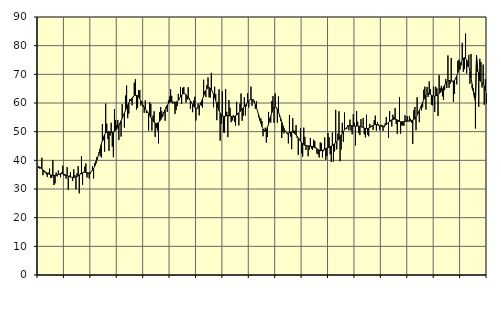
| Category | Piggar | Series 1 |
|---|---|---|
| nan | 37.4 | 37.91 |
| 87.0 | 37.1 | 37.67 |
| 87.0 | 37.5 | 37.23 |
| 87.0 | 40.9 | 36.98 |
| 87.0 | 34.8 | 36.65 |
| 87.0 | 35.7 | 36.35 |
| 87.0 | 36.1 | 36.06 |
| 87.0 | 35.1 | 35.8 |
| 87.0 | 34.2 | 35.53 |
| 87.0 | 35.7 | 35.3 |
| 87.0 | 37.1 | 35.1 |
| 87.0 | 33.9 | 34.94 |
| nan | 33.9 | 34.82 |
| 88.0 | 40.1 | 34.74 |
| 88.0 | 31.4 | 34.72 |
| 88.0 | 32 | 34.73 |
| 88.0 | 35.7 | 34.79 |
| 88.0 | 34.4 | 34.92 |
| 88.0 | 36.5 | 35.07 |
| 88.0 | 35 | 35.21 |
| 88.0 | 34.1 | 35.33 |
| 88.0 | 35.8 | 35.37 |
| 88.0 | 38.1 | 35.32 |
| 88.0 | 34.7 | 35.2 |
| nan | 34.6 | 35.03 |
| 89.0 | 33.6 | 34.81 |
| 89.0 | 37.6 | 34.59 |
| 89.0 | 29.7 | 34.43 |
| 89.0 | 34.7 | 34.28 |
| 89.0 | 35.9 | 34.17 |
| 89.0 | 34.1 | 34.1 |
| 89.0 | 32.8 | 34.07 |
| 89.0 | 36.9 | 34.06 |
| 89.0 | 34.9 | 34.1 |
| 89.0 | 29.9 | 34.19 |
| 89.0 | 35.5 | 34.35 |
| nan | 38 | 34.58 |
| 90.0 | 28.5 | 34.86 |
| 90.0 | 35.5 | 35.16 |
| 90.0 | 41.4 | 35.44 |
| 90.0 | 31.5 | 35.68 |
| 90.0 | 35.9 | 35.83 |
| 90.0 | 37.8 | 35.86 |
| 90.0 | 38.9 | 35.81 |
| 90.0 | 34 | 35.7 |
| 90.0 | 35.3 | 35.6 |
| 90.0 | 33.7 | 35.6 |
| 90.0 | 35.3 | 35.73 |
| nan | 36.3 | 36.01 |
| 91.0 | 38 | 36.48 |
| 91.0 | 33.7 | 37.14 |
| 91.0 | 39 | 37.92 |
| 91.0 | 39.8 | 38.86 |
| 91.0 | 41.2 | 39.98 |
| 91.0 | 41.2 | 41.25 |
| 91.0 | 42.9 | 42.61 |
| 91.0 | 41.6 | 44.04 |
| 91.0 | 41 | 45.51 |
| 91.0 | 52.7 | 46.9 |
| 91.0 | 47 | 48.07 |
| nan | 43 | 48.95 |
| 92.0 | 59.8 | 49.51 |
| 92.0 | 52.8 | 49.82 |
| 92.0 | 47.4 | 49.93 |
| 92.0 | 43.3 | 49.93 |
| 92.0 | 48.6 | 49.85 |
| 92.0 | 53.1 | 49.76 |
| 92.0 | 44.8 | 49.76 |
| 92.0 | 41.1 | 49.88 |
| 92.0 | 57.9 | 50.09 |
| 92.0 | 54 | 50.43 |
| 92.0 | 52.3 | 50.91 |
| nan | 54.1 | 51.53 |
| 93.0 | 47.1 | 52.24 |
| 93.0 | 52.5 | 53 |
| 93.0 | 48.3 | 53.83 |
| 93.0 | 59.6 | 54.7 |
| 93.0 | 55.5 | 55.57 |
| 93.0 | 51.4 | 56.46 |
| 93.0 | 62.6 | 57.4 |
| 93.0 | 66.1 | 58.38 |
| 93.0 | 54.7 | 59.29 |
| 93.0 | 56.3 | 60.06 |
| 93.0 | 61.4 | 60.71 |
| nan | 60.7 | 61.27 |
| 94.0 | 59.2 | 61.76 |
| 94.0 | 62 | 62.19 |
| 94.0 | 67.1 | 62.51 |
| 94.0 | 68.3 | 62.69 |
| 94.0 | 57.7 | 62.7 |
| 94.0 | 58.3 | 62.53 |
| 94.0 | 64.5 | 62.12 |
| 94.0 | 64.5 | 61.5 |
| 94.0 | 59.1 | 60.75 |
| 94.0 | 60.5 | 59.97 |
| 94.0 | 58.6 | 59.22 |
| nan | 56.6 | 58.55 |
| 95.0 | 60.9 | 57.95 |
| 95.0 | 56.5 | 57.43 |
| 95.0 | 56.6 | 56.9 |
| 95.0 | 50.4 | 56.31 |
| 95.0 | 60.3 | 55.67 |
| 95.0 | 59.7 | 55.01 |
| 95.0 | 50.4 | 54.36 |
| 95.0 | 55.6 | 53.76 |
| 95.0 | 57.1 | 53.28 |
| 95.0 | 48.2 | 52.98 |
| 95.0 | 51.3 | 52.87 |
| nan | 50.4 | 52.96 |
| 96.0 | 45.9 | 53.21 |
| 96.0 | 56.8 | 53.62 |
| 96.0 | 58.6 | 54.2 |
| 96.0 | 57.1 | 54.95 |
| 96.0 | 55.5 | 55.82 |
| 96.0 | 56.5 | 56.76 |
| 96.0 | 53.8 | 57.69 |
| 96.0 | 58.1 | 58.56 |
| 96.0 | 56.9 | 59.28 |
| 96.0 | 60.9 | 59.8 |
| 96.0 | 62.2 | 60.17 |
| nan | 64.8 | 60.37 |
| 97.0 | 62.5 | 60.42 |
| 97.0 | 59.8 | 60.38 |
| 97.0 | 60 | 60.29 |
| 97.0 | 56.2 | 60.24 |
| 97.0 | 57.5 | 60.3 |
| 97.0 | 58.9 | 60.53 |
| 97.0 | 63.2 | 60.95 |
| 97.0 | 61.3 | 61.53 |
| 97.0 | 65.6 | 62.17 |
| 97.0 | 59.7 | 62.76 |
| 97.0 | 65.3 | 63.16 |
| nan | 65.6 | 63.32 |
| 98.0 | 63.2 | 63.22 |
| 98.0 | 60.2 | 62.91 |
| 98.0 | 61.2 | 62.44 |
| 98.0 | 65.5 | 61.88 |
| 98.0 | 61.7 | 61.28 |
| 98.0 | 58 | 60.68 |
| 98.0 | 60.4 | 60.07 |
| 98.0 | 56.8 | 59.45 |
| 98.0 | 60.8 | 58.9 |
| 98.0 | 62.2 | 58.47 |
| 98.0 | 53.9 | 58.19 |
| nan | 58 | 58.13 |
| 99.0 | 59.8 | 58.35 |
| 99.0 | 55.7 | 58.83 |
| 99.0 | 60.1 | 59.54 |
| 99.0 | 59 | 60.44 |
| 99.0 | 58.4 | 61.45 |
| 99.0 | 68.1 | 62.49 |
| 99.0 | 64 | 63.49 |
| 99.0 | 62.1 | 64.35 |
| 99.0 | 66.3 | 64.95 |
| 99.0 | 68.9 | 65.28 |
| 99.0 | 62 | 65.35 |
| nan | 61.9 | 65.14 |
| 0.0 | 70.5 | 64.66 |
| 0.0 | 64.1 | 63.96 |
| 0.0 | 58.5 | 63.05 |
| 0.0 | 65.7 | 61.96 |
| 0.0 | 63.1 | 60.8 |
| 0.0 | 54 | 59.6 |
| 0.0 | 60.4 | 58.41 |
| 0.0 | 64.8 | 57.35 |
| 0.0 | 46.9 | 56.49 |
| 0.0 | 52.7 | 55.86 |
| 0.0 | 64.1 | 55.49 |
| nan | 49.7 | 55.36 |
| 1.0 | 49.6 | 55.38 |
| 1.0 | 64.8 | 55.45 |
| 1.0 | 56.9 | 55.55 |
| 1.0 | 48.1 | 55.62 |
| 1.0 | 61 | 55.58 |
| 1.0 | 58.3 | 55.47 |
| 1.0 | 53.3 | 55.35 |
| 1.0 | 53.9 | 55.22 |
| 1.0 | 55.8 | 55.18 |
| 1.0 | 53.5 | 55.28 |
| 1.0 | 52.1 | 55.48 |
| nan | 60.4 | 55.76 |
| 2.0 | 56.4 | 56.16 |
| 2.0 | 52.2 | 56.58 |
| 2.0 | 59.8 | 56.99 |
| 2.0 | 63.3 | 57.42 |
| 2.0 | 53.8 | 57.86 |
| 2.0 | 55.5 | 58.3 |
| 2.0 | 62 | 58.76 |
| 2.0 | 55.7 | 59.25 |
| 2.0 | 58.9 | 59.76 |
| 2.0 | 63.4 | 60.28 |
| 2.0 | 58.4 | 60.74 |
| nan | 61 | 61.08 |
| 3.0 | 65.7 | 61.23 |
| 3.0 | 59 | 61.17 |
| 3.0 | 61.3 | 60.85 |
| 3.0 | 60.8 | 60.25 |
| 3.0 | 58 | 59.42 |
| 3.0 | 60.6 | 58.38 |
| 3.0 | 57.1 | 57.16 |
| 3.0 | 55 | 55.81 |
| 3.0 | 53.9 | 54.41 |
| 3.0 | 54.7 | 53.04 |
| 3.0 | 53.7 | 51.84 |
| nan | 48.4 | 50.92 |
| 4.0 | 50 | 50.37 |
| 4.0 | 51.4 | 50.29 |
| 4.0 | 46.2 | 50.68 |
| 4.0 | 48.2 | 51.49 |
| 4.0 | 56.9 | 52.64 |
| 4.0 | 54.7 | 53.99 |
| 4.0 | 53.2 | 55.39 |
| 4.0 | 60.7 | 56.7 |
| 4.0 | 62.4 | 57.77 |
| 4.0 | 53.1 | 58.46 |
| 4.0 | 63.3 | 58.7 |
| nan | 58.2 | 58.5 |
| 5.0 | 53.1 | 57.88 |
| 5.0 | 62.3 | 56.91 |
| 5.0 | 55.2 | 55.76 |
| 5.0 | 53.7 | 54.53 |
| 5.0 | 47.8 | 53.3 |
| 5.0 | 49.9 | 52.14 |
| 5.0 | 49.4 | 51.14 |
| 5.0 | 50.3 | 50.34 |
| 5.0 | 49.9 | 49.8 |
| 5.0 | 49.1 | 49.54 |
| 5.0 | 45.9 | 49.49 |
| nan | 55.8 | 49.58 |
| 6.0 | 48.3 | 49.76 |
| 6.0 | 43.9 | 49.89 |
| 6.0 | 54.7 | 49.87 |
| 6.0 | 50.4 | 49.68 |
| 6.0 | 50.3 | 49.33 |
| 6.0 | 52.3 | 48.86 |
| 6.0 | 47.8 | 48.34 |
| 6.0 | 41.9 | 47.79 |
| 6.0 | 47.5 | 47.22 |
| 6.0 | 51.2 | 46.7 |
| 6.0 | 42.4 | 46.23 |
| nan | 41.3 | 45.83 |
| 7.0 | 51.4 | 45.49 |
| 7.0 | 48.2 | 45.27 |
| 7.0 | 43.6 | 45.16 |
| 7.0 | 45.2 | 45.1 |
| 7.0 | 41.4 | 45.06 |
| 7.0 | 43.8 | 45.01 |
| 7.0 | 47.8 | 44.94 |
| 7.0 | 44.1 | 44.88 |
| 7.0 | 43.7 | 44.79 |
| 7.0 | 47.2 | 44.64 |
| 7.0 | 46.7 | 44.47 |
| nan | 44.5 | 44.27 |
| 8.0 | 42.3 | 44.01 |
| 8.0 | 42.1 | 43.71 |
| 8.0 | 41 | 43.49 |
| 8.0 | 46.3 | 43.36 |
| 8.0 | 46 | 43.36 |
| 8.0 | 41 | 43.47 |
| 8.0 | 43.2 | 43.65 |
| 8.0 | 48 | 43.87 |
| 8.0 | 40.2 | 44.1 |
| 8.0 | 41.5 | 44.26 |
| 8.0 | 49.6 | 44.38 |
| nan | 48 | 44.53 |
| 9.0 | 42.1 | 44.73 |
| 9.0 | 39.4 | 44.98 |
| 9.0 | 49.7 | 45.25 |
| 9.0 | 39.6 | 45.53 |
| 9.0 | 43.1 | 45.81 |
| 9.0 | 57.6 | 46.14 |
| 9.0 | 43.8 | 46.54 |
| 9.0 | 49.3 | 47.02 |
| 9.0 | 57.1 | 47.56 |
| 9.0 | 39.7 | 48.19 |
| 9.0 | 43.8 | 48.82 |
| nan | 53.1 | 49.42 |
| 10.0 | 46.5 | 50.03 |
| 10.0 | 56.7 | 50.61 |
| 10.0 | 51.2 | 51.12 |
| 10.0 | 50.9 | 51.51 |
| 10.0 | 52.3 | 51.83 |
| 10.0 | 50.5 | 52.04 |
| 10.0 | 54.2 | 52.13 |
| 10.0 | 50.4 | 52.12 |
| 10.0 | 49.1 | 52.04 |
| 10.0 | 56.1 | 51.95 |
| 10.0 | 53.1 | 51.93 |
| nan | 45.2 | 51.94 |
| 11.0 | 57.2 | 51.96 |
| 11.0 | 53.5 | 51.97 |
| 11.0 | 49.5 | 51.92 |
| 11.0 | 48.8 | 51.84 |
| 11.0 | 54.4 | 51.73 |
| 11.0 | 51.6 | 51.58 |
| 11.0 | 54.8 | 51.41 |
| 11.0 | 49.1 | 51.25 |
| 11.0 | 48 | 51.13 |
| 11.0 | 55.9 | 51.08 |
| 11.0 | 49 | 51.11 |
| nan | 48.4 | 51.24 |
| 12.0 | 52.7 | 51.46 |
| 12.0 | 52 | 51.71 |
| 12.0 | 52.1 | 51.99 |
| 12.0 | 50.6 | 52.25 |
| 12.0 | 54 | 52.43 |
| 12.0 | 55.6 | 52.49 |
| 12.0 | 50.4 | 52.46 |
| 12.0 | 53.3 | 52.35 |
| 12.0 | 52.5 | 52.2 |
| 12.0 | 50.5 | 52.05 |
| 12.0 | 51.8 | 51.92 |
| nan | 52.4 | 51.87 |
| 13.0 | 50.3 | 51.88 |
| 13.0 | 51.5 | 51.97 |
| 13.0 | 52.9 | 52.19 |
| 13.0 | 55.1 | 52.51 |
| 13.0 | 53 | 52.86 |
| 13.0 | 47.8 | 53.21 |
| 13.0 | 57.2 | 53.54 |
| 13.0 | 53.6 | 53.86 |
| 13.0 | 51.8 | 54.12 |
| 13.0 | 55.9 | 54.31 |
| 13.0 | 55.1 | 54.4 |
| nan | 58.2 | 54.37 |
| 14.0 | 52.7 | 54.26 |
| 14.0 | 49.2 | 54.07 |
| 14.0 | 53.4 | 53.83 |
| 14.0 | 62 | 53.6 |
| 14.0 | 49.3 | 53.46 |
| 14.0 | 52.2 | 53.43 |
| 14.0 | 52.2 | 53.46 |
| 14.0 | 52 | 53.53 |
| 14.0 | 55.7 | 53.6 |
| 14.0 | 53.4 | 53.63 |
| 14.0 | 55.4 | 53.64 |
| nan | 53.8 | 53.64 |
| 15.0 | 55.4 | 53.67 |
| 15.0 | 54.5 | 53.76 |
| 15.0 | 53.1 | 53.89 |
| 15.0 | 45.7 | 54.03 |
| 15.0 | 57.5 | 54.24 |
| 15.0 | 58.6 | 54.59 |
| 15.0 | 50.5 | 55.1 |
| 15.0 | 62 | 55.75 |
| 15.0 | 56.5 | 56.5 |
| 15.0 | 53.3 | 57.36 |
| 15.0 | 58.4 | 58.31 |
| nan | 57.4 | 59.3 |
| 16.0 | 58.5 | 60.29 |
| 16.0 | 64.6 | 61.21 |
| 16.0 | 65.7 | 62.01 |
| 16.0 | 57.7 | 62.67 |
| 16.0 | 65.6 | 63.12 |
| 16.0 | 62.1 | 63.3 |
| 16.0 | 67.5 | 63.22 |
| 16.0 | 64.9 | 63 |
| 16.0 | 59.4 | 62.72 |
| 16.0 | 59.2 | 62.5 |
| 16.0 | 65.7 | 62.39 |
| nan | 56.9 | 62.4 |
| 17.0 | 65.7 | 62.5 |
| 17.0 | 65.1 | 62.67 |
| 17.0 | 55.5 | 62.93 |
| 17.0 | 69.7 | 63.26 |
| 17.0 | 65.2 | 63.68 |
| 17.0 | 66 | 64.2 |
| 17.0 | 62.3 | 64.83 |
| 17.0 | 61.1 | 65.53 |
| 17.0 | 64.5 | 66.25 |
| 17.0 | 68.4 | 66.91 |
| 17.0 | 65.2 | 67.4 |
| nan | 76.6 | 67.7 |
| 18.0 | 65.3 | 67.83 |
| 18.0 | 66.7 | 67.78 |
| 18.0 | 75.7 | 67.67 |
| 18.0 | 67.4 | 67.63 |
| 18.0 | 60.4 | 67.68 |
| 18.0 | 63.2 | 67.95 |
| 18.0 | 68.8 | 68.53 |
| 18.0 | 66.5 | 69.43 |
| 18.0 | 74.7 | 70.6 |
| 18.0 | 75.1 | 71.88 |
| 18.0 | 71.7 | 73.14 |
| nan | 73.1 | 74.24 |
| 19.0 | 81 | 75.07 |
| 19.0 | 70.9 | 75.62 |
| 19.0 | 71.8 | 75.81 |
| 19.0 | 84.2 | 75.59 |
| 19.0 | 70.3 | 75.03 |
| 19.0 | 72.7 | 74.09 |
| 19.0 | 76.8 | 72.71 |
| 19.0 | 66.7 | 70.9 |
| 19.0 | 77.1 | 68.76 |
| 19.0 | 65.1 | 66.45 |
| 19.0 | 65.2 | 64.17 |
| nan | 63.6 | 62.11 |
| 20.0 | 51.1 | 60.41 |
| 20.0 | 76.7 | 76.3 |
| 20.0 | 71.8 | 71.06 |
| 20.0 | 58.7 | 70.49 |
| 20.0 | 75.4 | 67.78 |
| 20.0 | 74.3 | 67.49 |
| 20.0 | 65.4 | 67.15 |
| 20.0 | 73.4 | 66.61 |
| 20.0 | 59.4 | 65.83 |
| 20.0 | 68.3 | 64.76 |
| 20.0 | 59.8 | 63.47 |